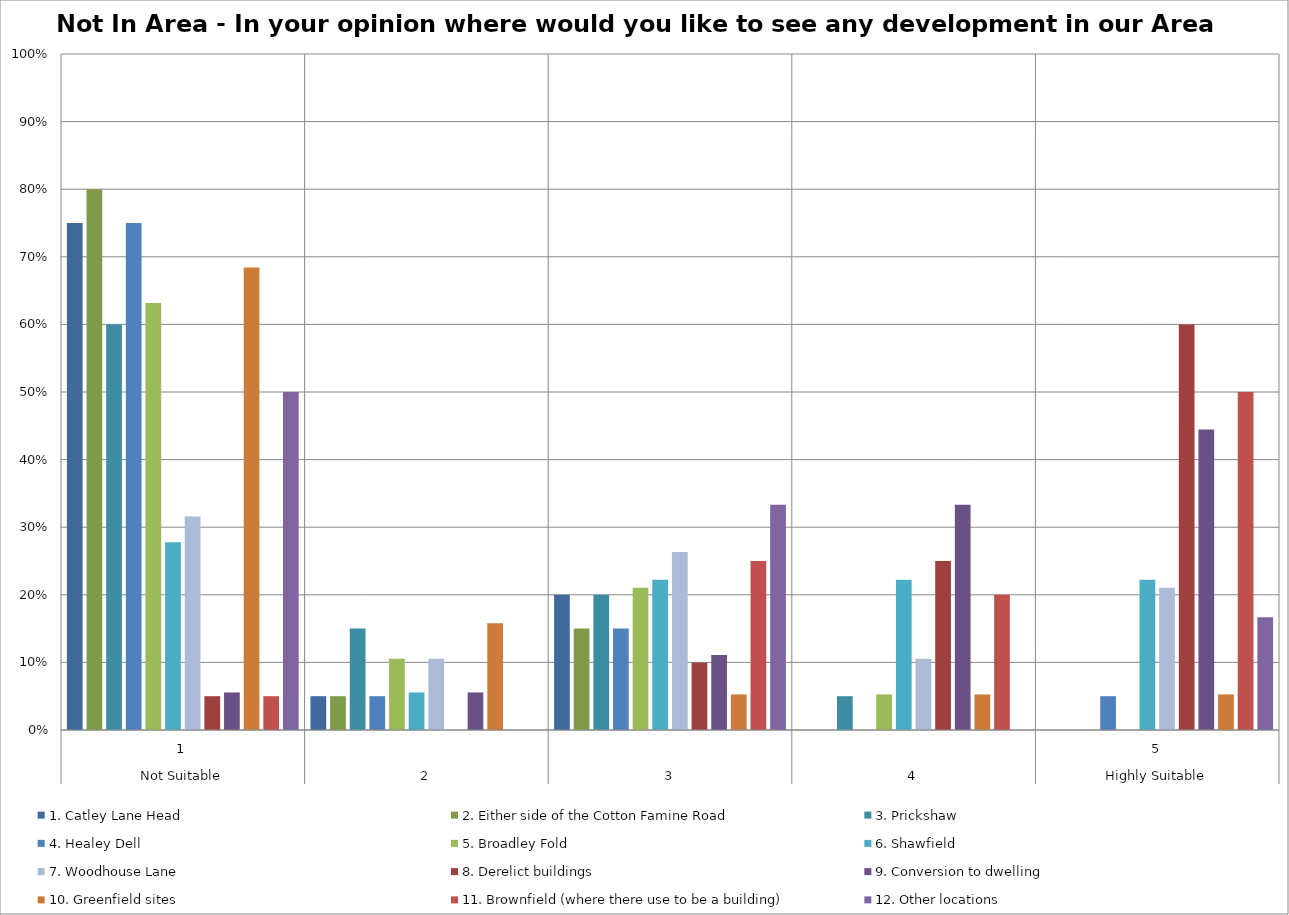
| Category | 1. Catley Lane Head | 2. Either side of the Cotton Famine Road | 3. Prickshaw | 4. Healey Dell | 5. Broadley Fold | 6. Shawfield | 7. Woodhouse Lane | 8. Derelict buildings | 9. Conversion to dwelling | 10. Greenfield sites | 11. Brownfield (where there use to be a building) | 12. Other locations |
|---|---|---|---|---|---|---|---|---|---|---|---|---|
| 0 | 0.75 | 0.8 | 0.6 | 0.75 | 0.632 | 0.278 | 0.316 | 0.05 | 0.056 | 0.684 | 0.05 | 0.5 |
| 1 | 0.05 | 0.05 | 0.15 | 0.05 | 0.105 | 0.056 | 0.105 | 0 | 0.056 | 0.158 | 0 | 0 |
| 2 | 0.2 | 0.15 | 0.2 | 0.15 | 0.211 | 0.222 | 0.263 | 0.1 | 0.111 | 0.053 | 0.25 | 0.333 |
| 3 | 0 | 0 | 0.05 | 0 | 0.053 | 0.222 | 0.105 | 0.25 | 0.333 | 0.053 | 0.2 | 0 |
| 4 | 0 | 0 | 0 | 0.05 | 0 | 0.222 | 0.211 | 0.6 | 0.444 | 0.053 | 0.5 | 0.167 |